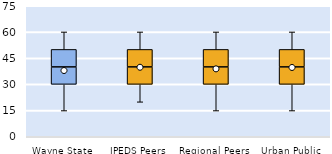
| Category | 25th | 50th | 75th |
|---|---|---|---|
| Wayne State | 30 | 10 | 10 |
| IPEDS Peers | 30 | 10 | 10 |
| Regional Peers | 30 | 10 | 10 |
| Urban Public | 30 | 10 | 10 |